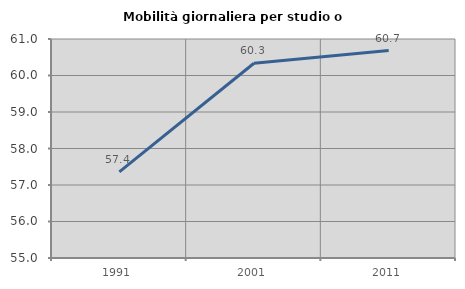
| Category | Mobilità giornaliera per studio o lavoro |
|---|---|
| 1991.0 | 57.361 |
| 2001.0 | 60.335 |
| 2011.0 | 60.684 |